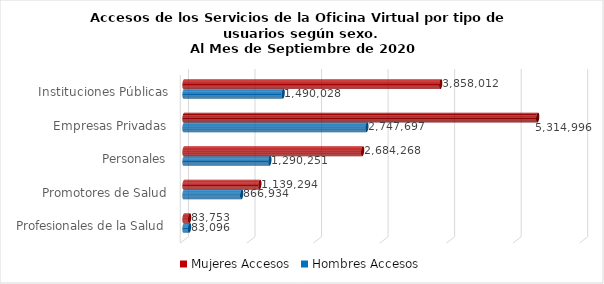
| Category | Mujeres | Hombres |
|---|---|---|
| Instituciones Públicas | 3858012 | 1490028 |
| Empresas Privadas | 5314996 | 2747697 |
| Personales | 2684268 | 1290251 |
| Promotores de Salud | 1139294 | 866934 |
| Profesionales de la Salud | 83753 | 83096 |